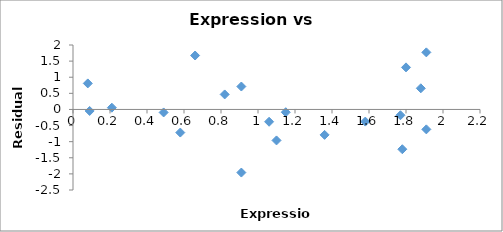
| Category | Series 0 |
|---|---|
| 1.58 | -0.377 |
| 0.09 | -0.047 |
| 0.82 | 0.465 |
| 0.58 | -0.717 |
| 1.91 | 1.772 |
| 1.88 | 0.656 |
| 1.15 | -0.086 |
| 1.1 | -0.962 |
| 1.06 | -0.382 |
| 1.8 | 1.305 |
| 0.91 | -1.959 |
| 0.66 | 1.674 |
| 0.91 | 0.711 |
| 0.08 | 0.808 |
| 0.21 | 0.054 |
| 1.91 | -0.618 |
| 1.36 | -0.789 |
| 0.49 | -0.093 |
| 1.77 | -0.18 |
| 1.78 | -1.235 |